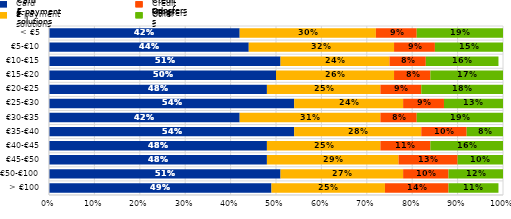
| Category | Cards | E-payment solutions | Credit transfers | Others |
|---|---|---|---|---|
| > €100 | 0.49 | 0.25 | 0.14 | 0.11 |
| €50-€100 | 0.51 | 0.27 | 0.1 | 0.12 |
| €45-€50 | 0.48 | 0.29 | 0.13 | 0.1 |
| €40-€45 | 0.48 | 0.25 | 0.11 | 0.16 |
| €35-€40 | 0.54 | 0.28 | 0.1 | 0.08 |
| €30-€35 | 0.42 | 0.31 | 0.08 | 0.19 |
| €25-€30 | 0.54 | 0.24 | 0.09 | 0.13 |
| €20-€25 | 0.48 | 0.25 | 0.09 | 0.18 |
| €15-€20 | 0.5 | 0.26 | 0.08 | 0.17 |
| €10-€15 | 0.51 | 0.24 | 0.08 | 0.16 |
| €5-€10 | 0.44 | 0.32 | 0.09 | 0.15 |
| < €5 | 0.42 | 0.3 | 0.09 | 0.19 |